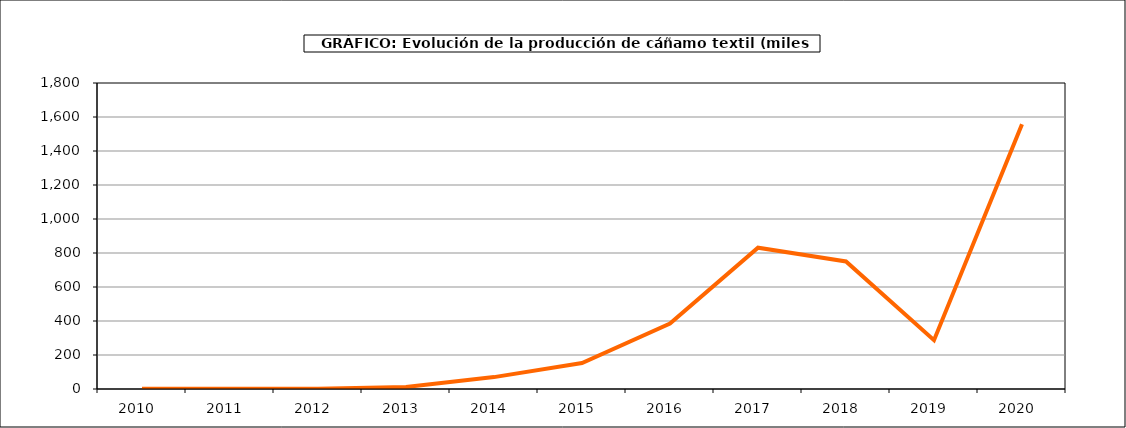
| Category | Producción |
|---|---|
| 2010.0 | 1 |
| 2011.0 | 1 |
| 2012.0 | 1 |
| 2013.0 | 12 |
| 2014.0 | 70 |
| 2015.0 | 153 |
| 2016.0 | 385 |
| 2017.0 | 831 |
| 2018.0 | 750 |
| 2019.0 | 287 |
| 2020.0 | 1557 |